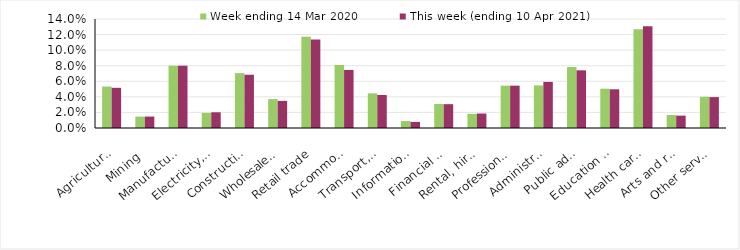
| Category | Week ending 14 Mar 2020 | This week (ending 10 Apr 2021) |
|---|---|---|
| Agriculture, forestry and fishing | 0.053 | 0.052 |
| Mining | 0.015 | 0.015 |
| Manufacturing | 0.08 | 0.08 |
| Electricity, gas, water and waste services | 0.019 | 0.02 |
| Construction | 0.07 | 0.068 |
| Wholesale trade | 0.037 | 0.035 |
| Retail trade | 0.117 | 0.114 |
| Accommodation and food services | 0.081 | 0.075 |
| Transport, postal and warehousing | 0.044 | 0.042 |
| Information media and telecommunications | 0.009 | 0.008 |
| Financial and insurance services | 0.031 | 0.031 |
| Rental, hiring and real estate services | 0.018 | 0.019 |
| Professional, scientific and technical services | 0.054 | 0.054 |
| Administrative and support services | 0.055 | 0.059 |
| Public administration and safety | 0.078 | 0.074 |
| Education and training | 0.05 | 0.05 |
| Health care and social assistance | 0.127 | 0.131 |
| Arts and recreation services | 0.017 | 0.016 |
| Other services | 0.04 | 0.04 |